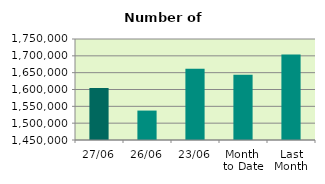
| Category | Series 0 |
|---|---|
| 27/06 | 1604646 |
| 26/06 | 1537390 |
| 23/06 | 1661946 |
| Month 
to Date | 1643861.474 |
| Last
Month | 1704183.545 |